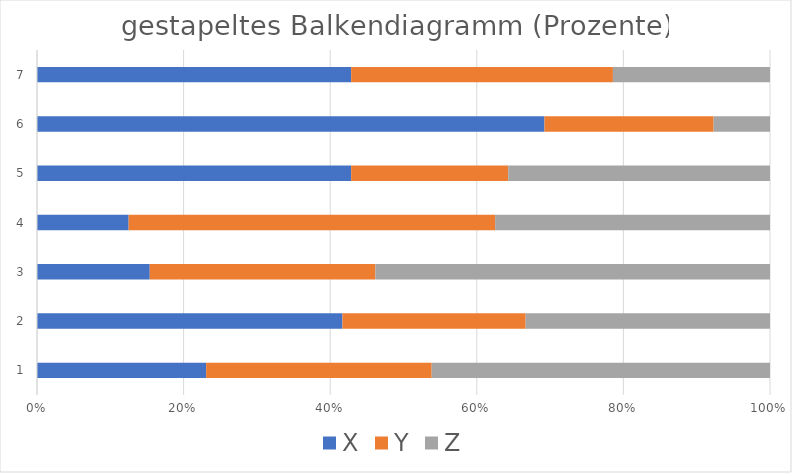
| Category | X | Y | Z |
|---|---|---|---|
| 0 | 3 | 4 | 6 |
| 1 | 5 | 3 | 4 |
| 2 | 2 | 4 | 7 |
| 3 | 1 | 4 | 3 |
| 4 | 6 | 3 | 5 |
| 5 | 9 | 3 | 1 |
| 6 | 6 | 5 | 3 |